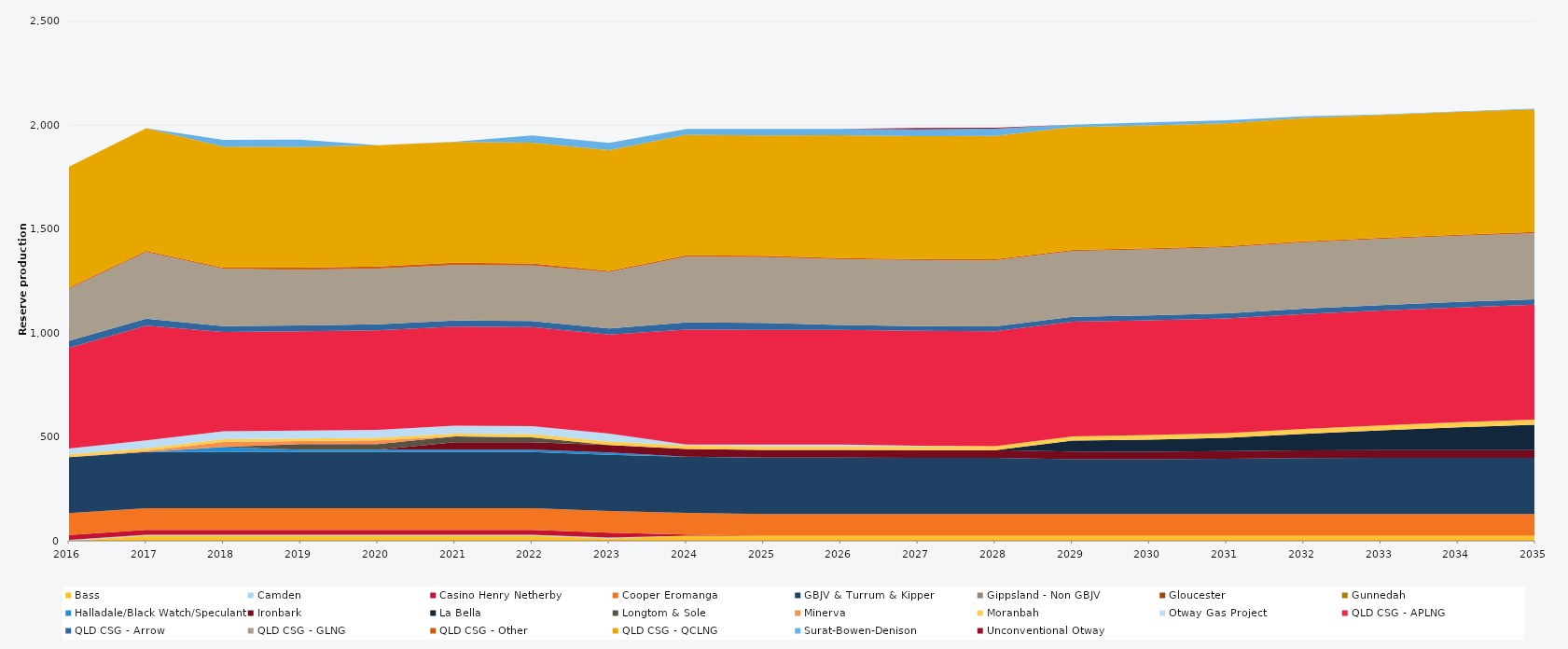
| Category | Bass | Camden | Casino Henry Netherby | Cooper Eromanga | GBJV & Turrum & Kipper | Gippsland - Non GBJV | Gloucester | Gunnedah | Halladale/Black Watch/Speculant | Ironbark | La Bella | Longtom & Sole | Minerva | Moranbah | Otway Gas Project | QLD CSG - APLNG | QLD CSG - Arrow | QLD CSG - GLNG | QLD CSG - Other | QLD CSG - QCLNG | Surat-Bowen-Denison | Unconventional Otway |
|---|---|---|---|---|---|---|---|---|---|---|---|---|---|---|---|---|---|---|---|---|---|---|
| 2016 | 0 | 5 | 23.12 | 105 | 270 | 0 | 0 | 0 | 0 | 0 | 0 | 0 | 0 | 12.867 | 28.323 | 484.728 | 34.038 | 250.546 | 5.856 | 581.813 | 0 | 0 |
| 2017 | 24.455 | 5 | 23.12 | 105 | 270 | 0 | 0 | 0 | 0 | 0 | 0 | 0 | 5.142 | 12.873 | 38 | 552.245 | 33.945 | 320.282 | 5.84 | 589.717 | 0 | 0 |
| 2018 | 24.455 | 5 | 23.12 | 105 | 270 | 0 | 0 | 0 | 23.725 | 0 | 0 | 1.143 | 23.725 | 13.04 | 38 | 477.621 | 28.853 | 276.018 | 5.84 | 582.419 | 31.885 | 0 |
| 2019 | 24.455 | 5 | 23.12 | 105 | 270 | 0 | 0 | 0 | 10.95 | 0 | 0 | 27.28 | 14.204 | 12.81 | 38 | 477.621 | 28.853 | 267.302 | 10.403 | 581.184 | 34.93 | 0 |
| 2020 | 24.522 | 5 | 23.12 | 105 | 270 | 0 | 0 | 0 | 10.95 | 0 | 0 | 27.45 | 17.679 | 12.781 | 38 | 478.929 | 28.932 | 268.19 | 10.419 | 582.663 | 0 | 0 |
| 2021 | 24.455 | 5 | 23.12 | 105 | 270 | 0 | 0 | 0 | 10.95 | 36.5 | 0 | 27.375 | 0 | 13.533 | 38 | 477.621 | 28.853 | 267.487 | 10.403 | 581.202 | 2 | 0 |
| 2022 | 24.455 | 5 | 23.12 | 105 | 270 | 0 | 0 | 0 | 10.95 | 36.5 | 0 | 23.234 | 0 | 15.298 | 38 | 477.621 | 28.853 | 267.135 | 10.403 | 581.104 | 34.93 | 0 |
| 2023 | 10.85 | 5 | 23.12 | 105 | 270 | 0 | 0 | 0 | 10.95 | 36.5 | 0 | 0 | 0 | 16.264 | 38 | 477.621 | 28.853 | 271.914 | 5.84 | 580.934 | 34.93 | 0 |
| 2024 | 24.522 | 0 | 5.3 | 105 | 270 | 0 | 0 | 0 | 0.208 | 36.6 | 0 | 0 | 0 | 16.79 | 4.734 | 553.758 | 34.038 | 317.359 | 5.856 | 580.592 | 28.135 | 0 |
| 2025 | 24.455 | 0 | 0 | 105 | 270 | 0 | 0 | 0 | 1.569 | 36.5 | 0 | 0 | 0 | 17.268 | 8.148 | 552.245 | 33.945 | 316.795 | 5.84 | 579.884 | 31.629 | 0 |
| 2026 | 24.455 | 0 | 0 | 105 | 270 | 0 | 0 | 0 | 1.402 | 36.5 | 0 | 0 | 0 | 17.518 | 8.61 | 552.245 | 22.841 | 316.693 | 5.84 | 591.753 | 30.324 | 0 |
| 2027 | 24.455 | 0 | 0 | 105 | 270 | 0 | 0 | 0 | 0.347 | 36.5 | 0 | 0 | 0 | 18.14 | 3.792 | 552.245 | 23.131 | 316.854 | 5.84 | 591.693 | 32.097 | 6.965 |
| 2028 | 24.522 | 0 | 0 | 105 | 270 | 0 | 0 | 0 | 0 | 36.6 | 0 | 0 | 0 | 18.99 | 0 | 553.758 | 23.47 | 317.828 | 5.856 | 593.234 | 34.608 | 4.035 |
| 2029 | 24.455 | 0 | 0 | 105 | 263.38 | 0 | 0 | 0 | 0 | 36.5 | 52.6 | 0 | 0 | 20.344 | 0 | 552.245 | 23.353 | 316.897 | 5.84 | 591.622 | 11.001 | 0 |
| 2030 | 24.455 | 0 | 0 | 105 | 263.006 | 0 | 0 | 0 | 0 | 36.5 | 58.467 | 0 | 0 | 21.608 | 0 | 552.245 | 23.602 | 317.279 | 5.84 | 591.579 | 14.279 | 0 |
| 2031 | 24.455 | 0 | 0 | 105 | 265.64 | 0 | 0 | 0 | 0 | 36.5 | 64.27 | 0 | 0 | 22.555 | 0 | 552.245 | 24.176 | 317.559 | 5.84 | 591.53 | 14.392 | 0 |
| 2032 | 24.522 | 0 | 0 | 105 | 269.157 | 0 | 0 | 0 | 0 | 36.6 | 79.643 | 0 | 0 | 23.473 | 0 | 553.758 | 25.27 | 318.687 | 5.856 | 593.07 | 7.723 | 0 |
| 2033 | 24.455 | 0 | 0 | 105 | 270 | 0 | 0 | 0 | 0 | 36.5 | 95.923 | 0 | 0 | 23.984 | 0 | 552.245 | 26.292 | 318.155 | 5.84 | 591.435 | 2.392 | 0 |
| 2034 | 24.455 | 0 | 0 | 105 | 270 | 0 | 0 | 0 | 0 | 36.5 | 110.37 | 0 | 0 | 24.559 | 0 | 552.245 | 26.478 | 318.338 | 5.84 | 591.394 | 1.719 | 0 |
| 2035 | 24.455 | 0 | 0 | 105 | 270 | 0 | 0 | 0 | 0 | 36.5 | 123.371 | 0 | 0 | 24.812 | 0 | 552.245 | 26.393 | 317.822 | 5.84 | 591.053 | 2.539 | 0 |